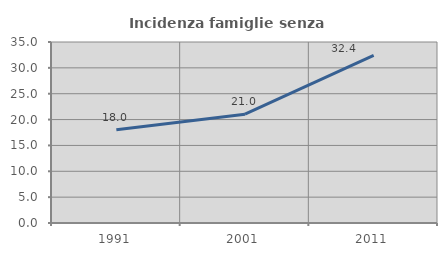
| Category | Incidenza famiglie senza nuclei |
|---|---|
| 1991.0 | 18.016 |
| 2001.0 | 21.043 |
| 2011.0 | 32.412 |